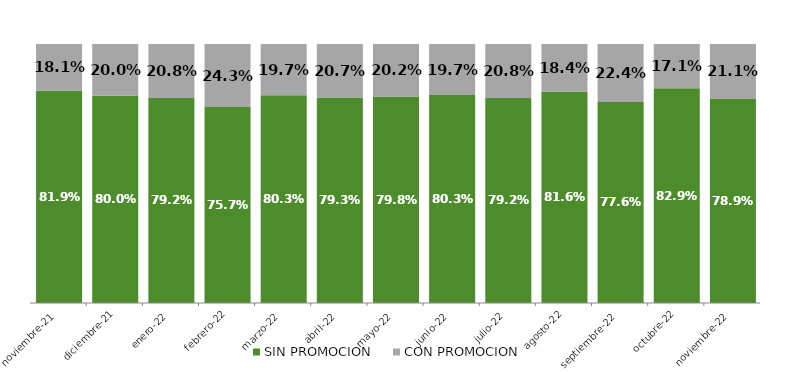
| Category | SIN PROMOCION   | CON PROMOCION   |
|---|---|---|
| 2021-11-01 | 0.819 | 0.181 |
| 2021-12-01 | 0.8 | 0.2 |
| 2022-01-01 | 0.792 | 0.208 |
| 2022-02-01 | 0.757 | 0.243 |
| 2022-03-01 | 0.803 | 0.197 |
| 2022-04-01 | 0.793 | 0.207 |
| 2022-05-01 | 0.798 | 0.202 |
| 2022-06-01 | 0.803 | 0.197 |
| 2022-07-01 | 0.792 | 0.208 |
| 2022-08-01 | 0.816 | 0.184 |
| 2022-09-01 | 0.776 | 0.224 |
| 2022-10-01 | 0.829 | 0.171 |
| 2022-11-01 | 0.789 | 0.211 |